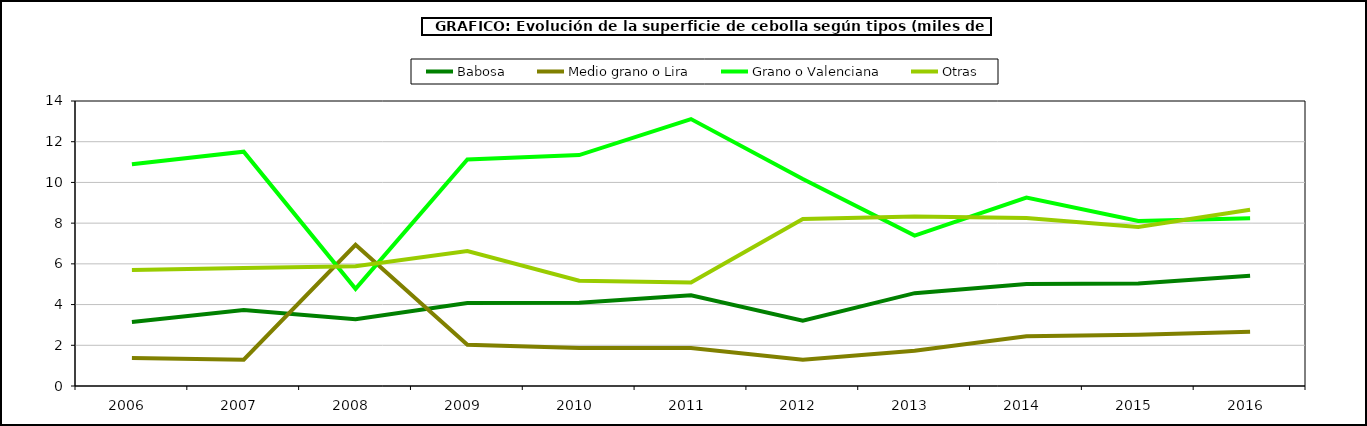
| Category | Babosa | Medio grano o Lira | Grano o Valenciana | Otras |
|---|---|---|---|---|
| 2006.0 | 3.141 | 1.38 | 10.889 | 5.698 |
| 2007.0 | 3.728 | 1.294 | 11.511 | 5.792 |
| 2008.0 | 3.278 | 6.937 | 4.775 | 5.878 |
| 2009.0 | 4.075 | 2.021 | 11.124 | 6.631 |
| 2010.0 | 4.091 | 1.869 | 11.342 | 5.176 |
| 2011.0 | 4.456 | 1.87 | 13.112 | 5.088 |
| 2012.0 | 3.212 | 1.284 | 10.171 | 8.2 |
| 2013.0 | 4.561 | 1.735 | 7.391 | 8.321 |
| 2014.0 | 5.014 | 2.441 | 9.254 | 8.252 |
| 2015.0 | 5.04 | 2.521 | 8.109 | 7.81 |
| 2016.0 | 5.414 | 2.662 | 8.238 | 8.655 |